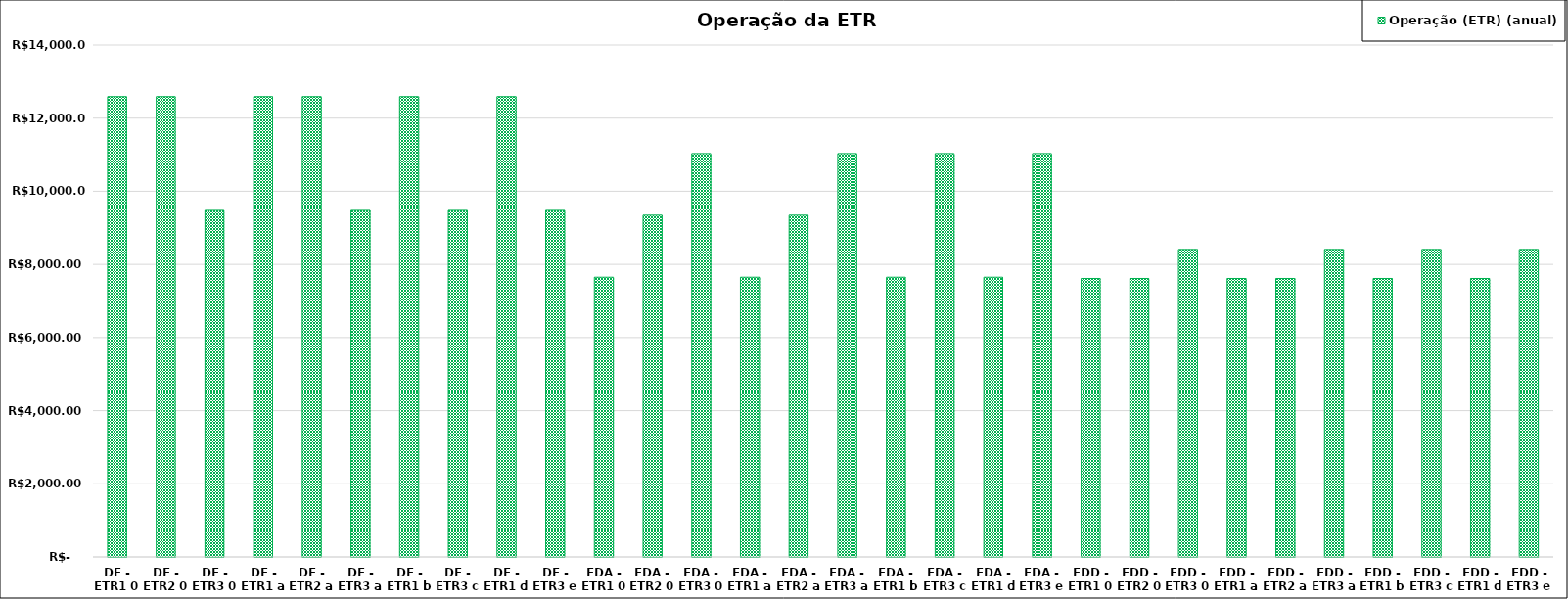
| Category | Operação (ETR) (anual) |
|---|---|
| DF - ETR1 0 | 12588.016 |
| DF - ETR2 0 | 12588.016 |
| DF - ETR3 0 | 9478.003 |
| DF - ETR1 a | 12588.016 |
| DF - ETR2 a | 12588.016 |
| DF - ETR3 a | 9478.003 |
| DF - ETR1 b | 12588.016 |
| DF - ETR3 c | 9478.003 |
| DF - ETR1 d | 12588.016 |
| DF - ETR3 e | 9478.003 |
| FDA - ETR1 0 | 7649.967 |
| FDA - ETR2 0 | 9346.101 |
| FDA - ETR3 0 | 11031.84 |
| FDA - ETR1 a | 7649.967 |
| FDA - ETR2 a | 9346.101 |
| FDA - ETR3 a | 11031.84 |
| FDA - ETR1 b | 7649.967 |
| FDA - ETR3 c | 11031.84 |
| FDA - ETR1 d | 7649.967 |
| FDA - ETR3 e | 11031.84 |
| FDD - ETR1 0 | 7615.899 |
| FDD - ETR2 0 | 7615.899 |
| FDD - ETR3 0 | 8409.24 |
| FDD - ETR1 a | 7615.899 |
| FDD - ETR2 a | 7615.899 |
| FDD - ETR3 a | 8409.24 |
| FDD - ETR1 b | 7615.899 |
| FDD - ETR3 c | 8409.24 |
| FDD - ETR1 d | 7615.899 |
| FDD - ETR3 e | 8409.24 |